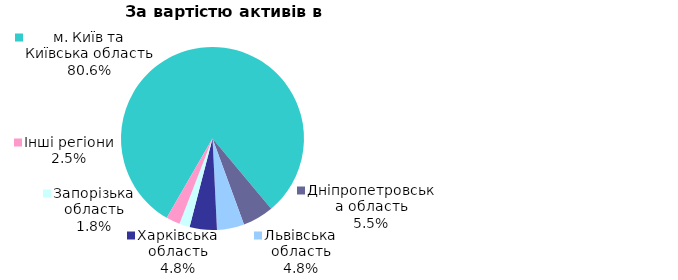
| Category | Series 0 |
|---|---|
| м. Київ та Київська область | 0.806 |
| Дніпропетровська область | 0.055 |
| Львівська область | 0.048 |
| Харківська область | 0.048 |
| Запорізька область | 0.018 |
| Інші регіони | 0.025 |